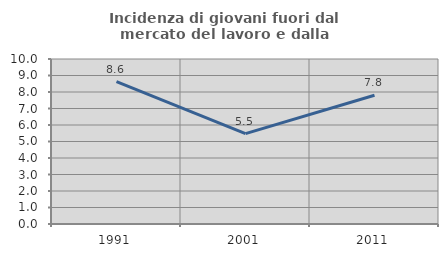
| Category | Incidenza di giovani fuori dal mercato del lavoro e dalla formazione  |
|---|---|
| 1991.0 | 8.631 |
| 2001.0 | 5.474 |
| 2011.0 | 7.801 |